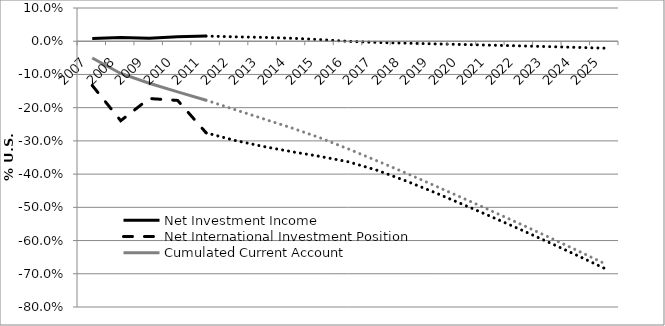
| Category | Net Investment Income | Net International Investment Position | Cumulated Current Account |
|---|---|---|---|
| 2007.0 | 0.008 | -0.133 | -0.051 |
| 2008.0 | 0.011 | -0.239 | -0.097 |
| 2009.0 | 0.009 | -0.172 | -0.127 |
| 2010.0 | 0.013 | -0.178 | -0.153 |
| 2011.0 | 0.016 | -0.276 | -0.178 |
| 2012.0 | 0.013 | -0.298 | -0.206 |
| 2013.0 | 0.012 | -0.317 | -0.233 |
| 2014.0 | 0.009 | -0.332 | -0.261 |
| 2015.0 | 0.005 | -0.347 | -0.291 |
| 2016.0 | 0 | -0.363 | -0.324 |
| 2017.0 | -0.004 | -0.388 | -0.36 |
| 2018.0 | -0.006 | -0.42 | -0.396 |
| 2019.0 | -0.008 | -0.454 | -0.434 |
| 2020.0 | -0.01 | -0.491 | -0.472 |
| 2021.0 | -0.012 | -0.528 | -0.51 |
| 2022.0 | -0.014 | -0.565 | -0.549 |
| 2023.0 | -0.016 | -0.604 | -0.588 |
| 2024.0 | -0.019 | -0.643 | -0.629 |
| 2025.0 | -0.021 | -0.684 | -0.67 |